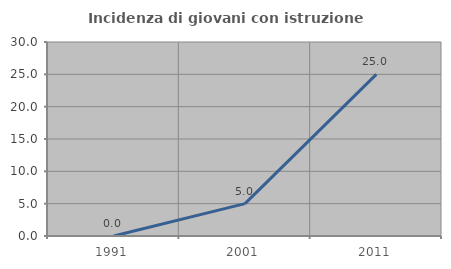
| Category | Incidenza di giovani con istruzione universitaria |
|---|---|
| 1991.0 | 0 |
| 2001.0 | 5 |
| 2011.0 | 25 |